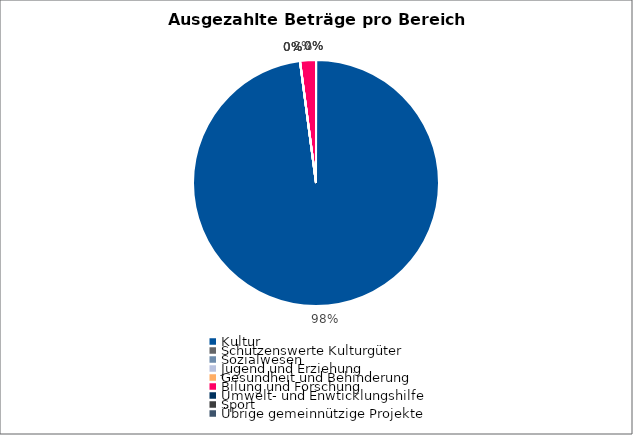
| Category | Series 0 |
|---|---|
| Kultur | 9697404.97 |
| Schützenswerte Kulturgüter | 0 |
| Sozialwesen | 0 |
| Jugend und Erziehung | 0 |
| Gesundheit und Behinderung | 1000 |
| Bilung und Forschung | 205799.02 |
| Umwelt- und Enwticklungshilfe | 0 |
| Sport | 0 |
| Übrige gemeinnützige Projekte | 0 |